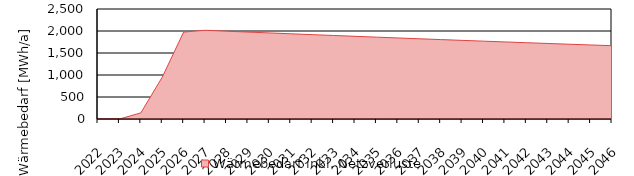
| Category | Wärmebedarf inkl. Netzverluste |
|---|---|
| 2022.0 | 0 |
| 2023.0 | 0 |
| 2024.0 | 138.889 |
| 2025.0 | 951.5 |
| 2026.0 | 1976.535 |
| 2027.0 | 2016.066 |
| 2028.0 | 1995.905 |
| 2029.0 | 1975.946 |
| 2030.0 | 1956.187 |
| 2031.0 | 1936.625 |
| 2032.0 | 1917.258 |
| 2033.0 | 1898.086 |
| 2034.0 | 1879.105 |
| 2035.0 | 1860.314 |
| 2036.0 | 1841.711 |
| 2037.0 | 1823.294 |
| 2038.0 | 1805.061 |
| 2039.0 | 1787.01 |
| 2040.0 | 1769.14 |
| 2041.0 | 1751.449 |
| 2042.0 | 1733.934 |
| 2043.0 | 1716.595 |
| 2044.0 | 1699.429 |
| 2045.0 | 1682.435 |
| 2046.0 | 1665.61 |